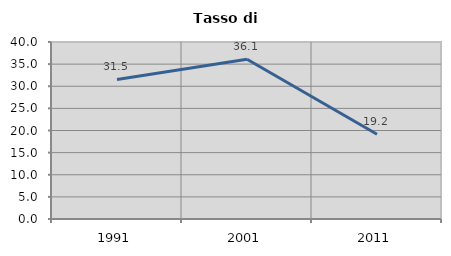
| Category | Tasso di disoccupazione   |
|---|---|
| 1991.0 | 31.527 |
| 2001.0 | 36.111 |
| 2011.0 | 19.162 |